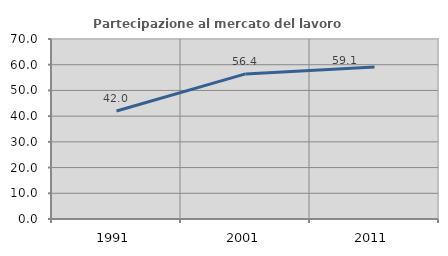
| Category | Partecipazione al mercato del lavoro  femminile |
|---|---|
| 1991.0 | 41.993 |
| 2001.0 | 56.426 |
| 2011.0 | 59.091 |